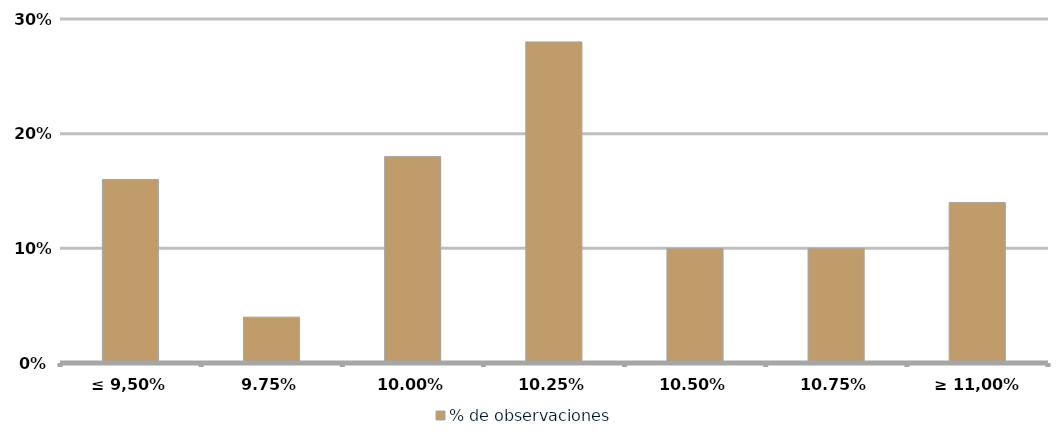
| Category | % de observaciones  |
|---|---|
| ≤ 9,50% | 0.16 |
| 9,75% | 0.04 |
| 10,00% | 0.18 |
| 10,25% | 0.28 |
| 10,50% | 0.1 |
| 10,75% | 0.1 |
| ≥ 11,00% | 0.14 |